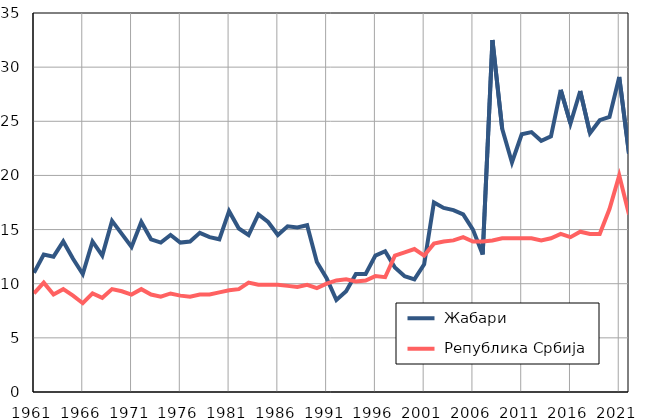
| Category |  Жабари |  Република Србија |
|---|---|---|
| 1961.0 | 11 | 9.1 |
| 1962.0 | 12.7 | 10.1 |
| 1963.0 | 12.5 | 9 |
| 1964.0 | 13.9 | 9.5 |
| 1965.0 | 12.3 | 8.9 |
| 1966.0 | 10.9 | 8.2 |
| 1967.0 | 13.9 | 9.1 |
| 1968.0 | 12.6 | 8.7 |
| 1969.0 | 15.8 | 9.5 |
| 1970.0 | 14.6 | 9.3 |
| 1971.0 | 13.4 | 9 |
| 1972.0 | 15.7 | 9.5 |
| 1973.0 | 14.1 | 9 |
| 1974.0 | 13.8 | 8.8 |
| 1975.0 | 14.5 | 9.1 |
| 1976.0 | 13.8 | 8.9 |
| 1977.0 | 13.9 | 8.8 |
| 1978.0 | 14.7 | 9 |
| 1979.0 | 14.3 | 9 |
| 1980.0 | 14.1 | 9.2 |
| 1981.0 | 16.7 | 9.4 |
| 1982.0 | 15.1 | 9.5 |
| 1983.0 | 14.5 | 10.1 |
| 1984.0 | 16.4 | 9.9 |
| 1985.0 | 15.7 | 9.9 |
| 1986.0 | 14.5 | 9.9 |
| 1987.0 | 15.3 | 9.8 |
| 1988.0 | 15.2 | 9.7 |
| 1989.0 | 15.4 | 9.9 |
| 1990.0 | 12 | 9.6 |
| 1991.0 | 10.5 | 10 |
| 1992.0 | 8.5 | 10.3 |
| 1993.0 | 9.3 | 10.4 |
| 1994.0 | 10.9 | 10.2 |
| 1995.0 | 10.9 | 10.3 |
| 1996.0 | 12.6 | 10.7 |
| 1997.0 | 13 | 10.6 |
| 1998.0 | 11.5 | 12.6 |
| 1999.0 | 10.7 | 12.9 |
| 2000.0 | 10.4 | 13.2 |
| 2001.0 | 11.8 | 12.6 |
| 2002.0 | 17.5 | 13.7 |
| 2003.0 | 17 | 13.9 |
| 2004.0 | 16.8 | 14 |
| 2005.0 | 16.4 | 14.3 |
| 2006.0 | 15 | 13.9 |
| 2007.0 | 12.7 | 13.9 |
| 2008.0 | 32.5 | 14 |
| 2009.0 | 24.3 | 14.2 |
| 2010.0 | 21.2 | 14.2 |
| 2011.0 | 23.8 | 14.2 |
| 2012.0 | 24 | 14.2 |
| 2013.0 | 23.2 | 14 |
| 2014.0 | 23.6 | 14.2 |
| 2015.0 | 27.9 | 14.6 |
| 2016.0 | 24.8 | 14.3 |
| 2017.0 | 27.8 | 14.8 |
| 2018.0 | 23.9 | 14.6 |
| 2019.0 | 25.1 | 14.6 |
| 2020.0 | 25.4 | 16.9 |
| 2021.0 | 29.1 | 20 |
| 2022.0 | 22 | 16.4 |